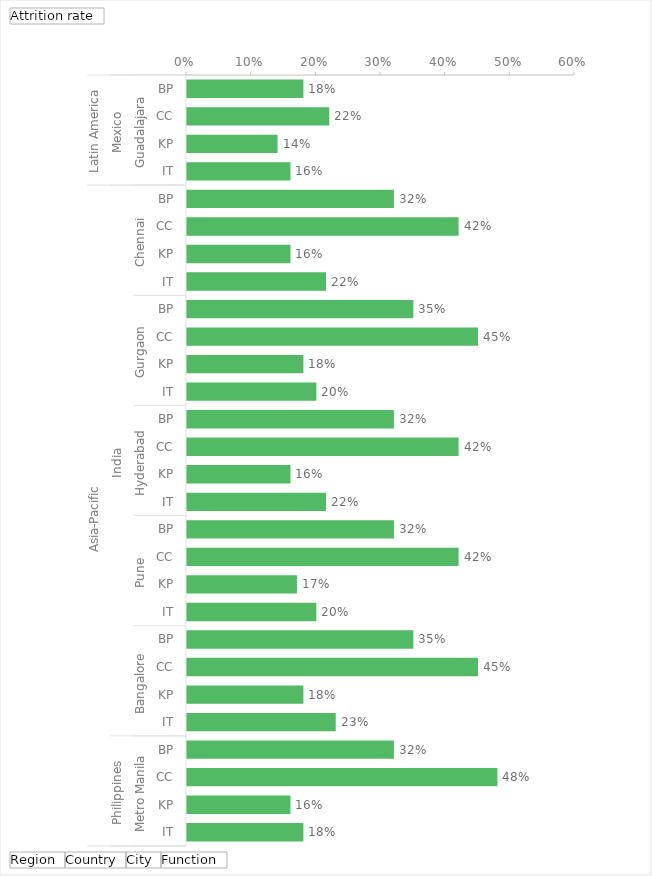
| Category | Total |
|---|---|
| 0 | 0.18 |
| 1 | 0.22 |
| 2 | 0.14 |
| 3 | 0.16 |
| 4 | 0.32 |
| 5 | 0.42 |
| 6 | 0.16 |
| 7 | 0.215 |
| 8 | 0.35 |
| 9 | 0.45 |
| 10 | 0.18 |
| 11 | 0.2 |
| 12 | 0.32 |
| 13 | 0.42 |
| 14 | 0.16 |
| 15 | 0.215 |
| 16 | 0.32 |
| 17 | 0.42 |
| 18 | 0.17 |
| 19 | 0.2 |
| 20 | 0.35 |
| 21 | 0.45 |
| 22 | 0.18 |
| 23 | 0.23 |
| 24 | 0.32 |
| 25 | 0.48 |
| 26 | 0.16 |
| 27 | 0.18 |